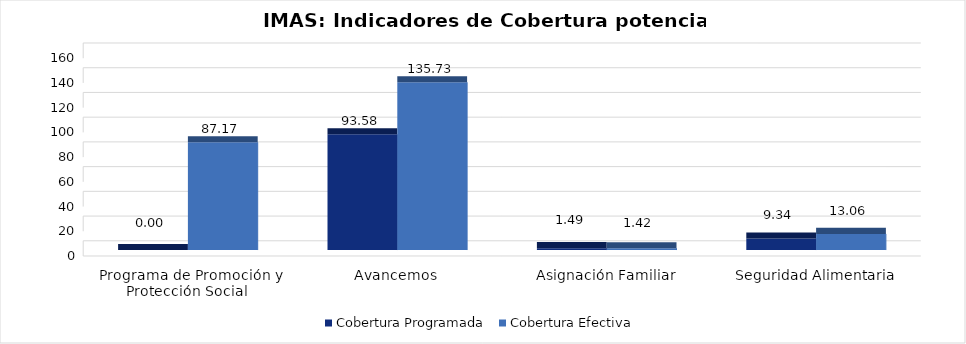
| Category | Cobertura Programada | Cobertura Efectiva |
|---|---|---|
| Programa de Promoción y Protección Social | 0 | 87.168 |
| Avancemos | 93.579 | 135.73 |
| Asignación Familiar | 1.493 | 1.424 |
| Seguridad Alimentaria | 9.338 | 13.059 |